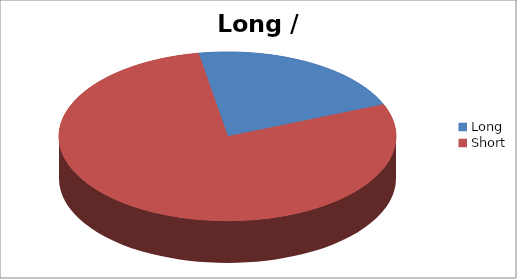
| Category | Series 1 |
|---|---|
| Long | 30 |
| Short | 109 |